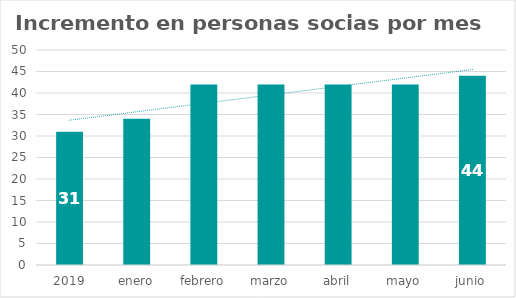
| Category | Series 0 |
|---|---|
| 2019 | 31 |
| enero | 34 |
| febrero | 42 |
| marzo | 42 |
| abril | 42 |
| mayo | 42 |
| junio | 44 |